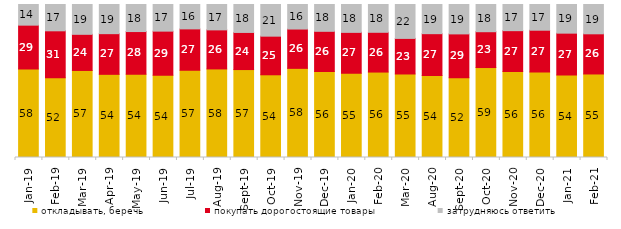
| Category | откладывать, беречь | покупать дорогостоящие товары | затрудняюсь ответить |
|---|---|---|---|
| 2019-01-01 | 57.8 | 28.7 | 13.5 |
| 2019-02-01 | 52.1 | 30.7 | 17.2 |
| 2019-03-01 | 56.887 | 23.62 | 19.493 |
| 2019-04-01 | 54.356 | 26.584 | 19.059 |
| 2019-05-01 | 54.383 | 27.935 | 17.682 |
| 2019-06-01 | 53.815 | 28.778 | 17.406 |
| 2019-07-01 | 57.079 | 26.98 | 15.941 |
| 2019-08-01 | 57.892 | 25.524 | 16.583 |
| 2019-09-01 | 57.475 | 24.257 | 18.267 |
| 2019-10-01 | 54.059 | 25.248 | 20.693 |
| 2019-11-01 | 58.267 | 25.693 | 16.04 |
| 2019-12-01 | 56.139 | 26.337 | 17.525 |
| 2020-01-01 | 55.099 | 26.683 | 18.218 |
| 2020-02-01 | 55.842 | 25.99 | 18.168 |
| 2020-03-01 | 54.586 | 23.252 | 22.162 |
| 2020-08-01 | 53.625 | 27.309 | 19.067 |
| 2020-09-01 | 52.165 | 28.621 | 19.214 |
| 2020-10-01 | 58.794 | 23.418 | 17.788 |
| 2020-11-01 | 56.2 | 26.7 | 17.1 |
| 2020-12-01 | 55.875 | 27.318 | 16.807 |
| 2021-01-01 | 53.949 | 27.322 | 18.728 |
| 2021-02-01 | 54.591 | 26.253 | 19.156 |